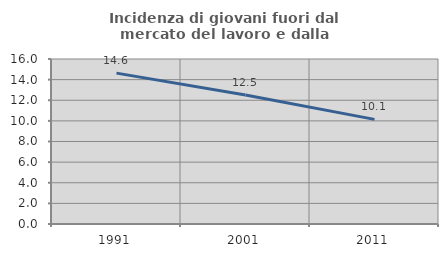
| Category | Incidenza di giovani fuori dal mercato del lavoro e dalla formazione  |
|---|---|
| 1991.0 | 14.632 |
| 2001.0 | 12.5 |
| 2011.0 | 10.145 |